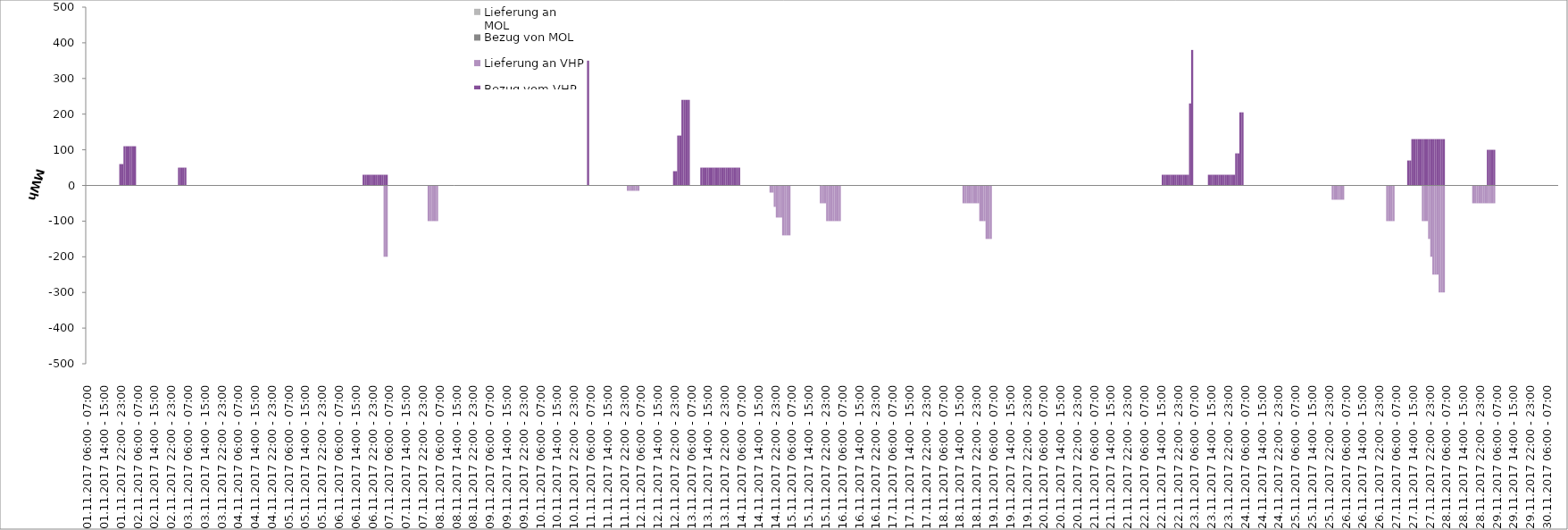
| Category | Bezug vom VHP | Lieferung an VHP | Bezug von MOL | Lieferung an MOL |
|---|---|---|---|---|
| 01.11.2017 06:00 - 07:00 | 0 | 0 | 0 | 0 |
| 01.11.2017 07:00 - 08:00 | 0 | 0 | 0 | 0 |
| 01.11.2017 08:00 - 09:00 | 0 | 0 | 0 | 0 |
| 01.11.2017 09:00 - 10:00 | 0 | 0 | 0 | 0 |
| 01.11.2017 10:00 - 11:00 | 0 | 0 | 0 | 0 |
| 01.11.2017 11:00 - 12:00 | 0 | 0 | 0 | 0 |
| 01.11.2017 12:00 - 13:00 | 0 | 0 | 0 | 0 |
| 01.11.2017 13:00 - 14:00 | 0 | 0 | 0 | 0 |
| 01.11.2017 14:00 - 15:00 | 0 | 0 | 0 | 0 |
| 01.11.2017 15:00 - 16:00 | 0 | 0 | 0 | 0 |
| 01.11.2017 16:00 - 17:00 | 0 | 0 | 0 | 0 |
| 01.11.2017 17:00 - 18:00 | 0 | 0 | 0 | 0 |
| 01.11.2017 18:00 - 19:00 | 0 | 0 | 0 | 0 |
| 01.11.2017 19:00 - 20:00 | 0 | 0 | 0 | 0 |
| 01.11.2017 20:00 - 21:00 | 0 | 0 | 0 | 0 |
| 01.11.2017 21:00 - 22:00 | 0 | 0 | 0 | 0 |
| 01.11.2017 22:00 - 23:00 | 60 | 0 | 0 | 0 |
| 01.11.2017 23:00 - 24:00 | 60 | 0 | 0 | 0 |
| 02.11.2017 00:00 - 01:00 | 110 | 0 | 0 | 0 |
| 02.11.2017 01:00 - 02:00 | 110 | 0 | 0 | 0 |
| 02.11.2017 02:00 - 03:00 | 110 | 0 | 0 | 0 |
| 02.11.2017 03:00 - 04:00 | 110 | 0 | 0 | 0 |
| 02.11.2017 04:00 - 05:00 | 110 | 0 | 0 | 0 |
| 02.11.2017 05:00 - 06:00 | 110 | 0 | 0 | 0 |
| 02.11.2017 06:00 - 07:00 | 0 | 0 | 0 | 0 |
| 02.11.2017 07:00 - 08:00 | 0 | 0 | 0 | 0 |
| 02.11.2017 08:00 - 09:00 | 0 | 0 | 0 | 0 |
| 02.11.2017 09:00 - 10:00 | 0 | 0 | 0 | 0 |
| 02.11.2017 10:00 - 11:00 | 0 | 0 | 0 | 0 |
| 02.11.2017 11:00 - 12:00 | 0 | 0 | 0 | 0 |
| 02.11.2017 12:00 - 13:00 | 0 | 0 | 0 | 0 |
| 02.11.2017 13:00 - 14:00 | 0 | 0 | 0 | 0 |
| 02.11.2017 14:00 - 15:00 | 0 | 0 | 0 | 0 |
| 02.11.2017 15:00 - 16:00 | 0 | 0 | 0 | 0 |
| 02.11.2017 16:00 - 17:00 | 0 | 0 | 0 | 0 |
| 02.11.2017 17:00 - 18:00 | 0 | 0 | 0 | 0 |
| 02.11.2017 18:00 - 19:00 | 0 | 0 | 0 | 0 |
| 02.11.2017 19:00 - 20:00 | 0 | 0 | 0 | 0 |
| 02.11.2017 20:00 - 21:00 | 0 | 0 | 0 | 0 |
| 02.11.2017 21:00 - 22:00 | 0 | 0 | 0 | 0 |
| 02.11.2017 22:00 - 23:00 | 0 | 0 | 0 | 0 |
| 02.11.2017 23:00 - 24:00 | 0 | 0 | 0 | 0 |
| 03.11.2017 00:00 - 01:00 | 0 | 0 | 0 | 0 |
| 03.11.2017 01:00 - 02:00 | 0 | 0 | 0 | 0 |
| 03.11.2017 02:00 - 03:00 | 50 | 0 | 0 | 0 |
| 03.11.2017 03:00 - 04:00 | 50 | 0 | 0 | 0 |
| 03.11.2017 04:00 - 05:00 | 50 | 0 | 0 | 0 |
| 03.11.2017 05:00 - 06:00 | 50 | 0 | 0 | 0 |
| 03.11.2017 06:00 - 07:00 | 0 | 0 | 0 | 0 |
| 03.11.2017 07:00 - 08:00 | 0 | 0 | 0 | 0 |
| 03.11.2017 08:00 - 09:00 | 0 | 0 | 0 | 0 |
| 03.11.2017 09:00 - 10:00 | 0 | 0 | 0 | 0 |
| 03.11.2017 10:00 - 11:00 | 0 | 0 | 0 | 0 |
| 03.11.2017 11:00 - 12:00 | 0 | 0 | 0 | 0 |
| 03.11.2017 12:00 - 13:00 | 0 | 0 | 0 | 0 |
| 03.11.2017 13:00 - 14:00 | 0 | 0 | 0 | 0 |
| 03.11.2017 14:00 - 15:00 | 0 | 0 | 0 | 0 |
| 03.11.2017 15:00 - 16:00 | 0 | 0 | 0 | 0 |
| 03.11.2017 16:00 - 17:00 | 0 | 0 | 0 | 0 |
| 03.11.2017 17:00 - 18:00 | 0 | 0 | 0 | 0 |
| 03.11.2017 18:00 - 19:00 | 0 | 0 | 0 | 0 |
| 03.11.2017 19:00 - 20:00 | 0 | 0 | 0 | 0 |
| 03.11.2017 20:00 - 21:00 | 0 | 0 | 0 | 0 |
| 03.11.2017 21:00 - 22:00 | 0 | 0 | 0 | 0 |
| 03.11.2017 22:00 - 23:00 | 0 | 0 | 0 | 0 |
| 03.11.2017 23:00 - 24:00 | 0 | 0 | 0 | 0 |
| 04.11.2017 00:00 - 01:00 | 0 | 0 | 0 | 0 |
| 04.11.2017 01:00 - 02:00 | 0 | 0 | 0 | 0 |
| 04.11.2017 02:00 - 03:00 | 0 | 0 | 0 | 0 |
| 04.11.2017 03:00 - 04:00 | 0 | 0 | 0 | 0 |
| 04.11.2017 04:00 - 05:00 | 0 | 0 | 0 | 0 |
| 04.11.2017 05:00 - 06:00 | 0 | 0 | 0 | 0 |
| 04.11.2017 06:00 - 07:00 | 0 | 0 | 0 | 0 |
| 04.11.2017 07:00 - 08:00 | 0 | 0 | 0 | 0 |
| 04.11.2017 08:00 - 09:00 | 0 | 0 | 0 | 0 |
| 04.11.2017 09:00 - 10:00 | 0 | 0 | 0 | 0 |
| 04.11.2017 10:00 - 11:00 | 0 | 0 | 0 | 0 |
| 04.11.2017 11:00 - 12:00 | 0 | 0 | 0 | 0 |
| 04.11.2017 12:00 - 13:00 | 0 | 0 | 0 | 0 |
| 04.11.2017 13:00 - 14:00 | 0 | 0 | 0 | 0 |
| 04.11.2017 14:00 - 15:00 | 0 | 0 | 0 | 0 |
| 04.11.2017 15:00 - 16:00 | 0 | 0 | 0 | 0 |
| 04.11.2017 16:00 - 17:00 | 0 | 0 | 0 | 0 |
| 04.11.2017 17:00 - 18:00 | 0 | 0 | 0 | 0 |
| 04.11.2017 18:00 - 19:00 | 0 | 0 | 0 | 0 |
| 04.11.2017 19:00 - 20:00 | 0 | 0 | 0 | 0 |
| 04.11.2017 20:00 - 21:00 | 0 | 0 | 0 | 0 |
| 04.11.2017 21:00 - 22:00 | 0 | 0 | 0 | 0 |
| 04.11.2017 22:00 - 23:00 | 0 | 0 | 0 | 0 |
| 04.11.2017 23:00 - 24:00 | 0 | 0 | 0 | 0 |
| 05.11.2017 00:00 - 01:00 | 0 | 0 | 0 | 0 |
| 05.11.2017 01:00 - 02:00 | 0 | 0 | 0 | 0 |
| 05.11.2017 02:00 - 03:00 | 0 | 0 | 0 | 0 |
| 05.11.2017 03:00 - 04:00 | 0 | 0 | 0 | 0 |
| 05.11.2017 04:00 - 05:00 | 0 | 0 | 0 | 0 |
| 05.11.2017 05:00 - 06:00 | 0 | 0 | 0 | 0 |
| 05.11.2017 06:00 - 07:00 | 0 | 0 | 0 | 0 |
| 05.11.2017 07:00 - 08:00 | 0 | 0 | 0 | 0 |
| 05.11.2017 08:00 - 09:00 | 0 | 0 | 0 | 0 |
| 05.11.2017 09:00 - 10:00 | 0 | 0 | 0 | 0 |
| 05.11.2017 10:00 - 11:00 | 0 | 0 | 0 | 0 |
| 05.11.2017 11:00 - 12:00 | 0 | 0 | 0 | 0 |
| 05.11.2017 12:00 - 13:00 | 0 | 0 | 0 | 0 |
| 05.11.2017 13:00 - 14:00 | 0 | 0 | 0 | 0 |
| 05.11.2017 14:00 - 15:00 | 0 | 0 | 0 | 0 |
| 05.11.2017 15:00 - 16:00 | 0 | 0 | 0 | 0 |
| 05.11.2017 16:00 - 17:00 | 0 | 0 | 0 | 0 |
| 05.11.2017 17:00 - 18:00 | 0 | 0 | 0 | 0 |
| 05.11.2017 18:00 - 19:00 | 0 | 0 | 0 | 0 |
| 05.11.2017 19:00 - 20:00 | 0 | 0 | 0 | 0 |
| 05.11.2017 20:00 - 21:00 | 0 | 0 | 0 | 0 |
| 05.11.2017 21:00 - 22:00 | 0 | 0 | 0 | 0 |
| 05.11.2017 22:00 - 23:00 | 0 | 0 | 0 | 0 |
| 05.11.2017 23:00 - 24:00 | 0 | 0 | 0 | 0 |
| 06.11.2017 00:00 - 01:00 | 0 | 0 | 0 | 0 |
| 06.11.2017 01:00 - 02:00 | 0 | 0 | 0 | 0 |
| 06.11.2017 02:00 - 03:00 | 0 | 0 | 0 | 0 |
| 06.11.2017 03:00 - 04:00 | 0 | 0 | 0 | 0 |
| 06.11.2017 04:00 - 05:00 | 0 | 0 | 0 | 0 |
| 06.11.2017 05:00 - 06:00 | 0 | 0 | 0 | 0 |
| 06.11.2017 06:00 - 07:00 | 0 | 0 | 0 | 0 |
| 06.11.2017 07:00 - 08:00 | 0 | 0 | 0 | 0 |
| 06.11.2017 08:00 - 09:00 | 0 | 0 | 0 | 0 |
| 06.11.2017 09:00 - 10:00 | 0 | 0 | 0 | 0 |
| 06.11.2017 10:00 - 11:00 | 0 | 0 | 0 | 0 |
| 06.11.2017 11:00 - 12:00 | 0 | 0 | 0 | 0 |
| 06.11.2017 12:00 - 13:00 | 0 | 0 | 0 | 0 |
| 06.11.2017 13:00 - 14:00 | 0 | 0 | 0 | 0 |
| 06.11.2017 14:00 - 15:00 | 0 | 0 | 0 | 0 |
| 06.11.2017 15:00 - 16:00 | 0 | 0 | 0 | 0 |
| 06.11.2017 16:00 - 17:00 | 0 | 0 | 0 | 0 |
| 06.11.2017 17:00 - 18:00 | 0 | 0 | 0 | 0 |
| 06.11.2017 18:00 - 19:00 | 30 | 0 | 0 | 0 |
| 06.11.2017 19:00 - 20:00 | 30 | 0 | 0 | 0 |
| 06.11.2017 20:00 - 21:00 | 30 | 0 | 0 | 0 |
| 06.11.2017 21:00 - 22:00 | 30 | 0 | 0 | 0 |
| 06.11.2017 22:00 - 23:00 | 30 | 0 | 0 | 0 |
| 06.11.2017 23:00 - 24:00 | 30 | 0 | 0 | 0 |
| 07.11.2017 00:00 - 01:00 | 30 | 0 | 0 | 0 |
| 07.11.2017 01:00 - 02:00 | 30 | 0 | 0 | 0 |
| 07.11.2017 02:00 - 03:00 | 30 | 0 | 0 | 0 |
| 07.11.2017 03:00 - 04:00 | 30 | 0 | 0 | 0 |
| 07.11.2017 04:00 - 05:00 | 30 | -200 | 0 | 0 |
| 07.11.2017 05:00 - 06:00 | 30 | -200 | 0 | 0 |
| 07.11.2017 06:00 - 07:00 | 0 | 0 | 0 | 0 |
| 07.11.2017 07:00 - 08:00 | 0 | 0 | 0 | 0 |
| 07.11.2017 08:00 - 09:00 | 0 | 0 | 0 | 0 |
| 07.11.2017 09:00 - 10:00 | 0 | 0 | 0 | 0 |
| 07.11.2017 10:00 - 11:00 | 0 | 0 | 0 | 0 |
| 07.11.2017 11:00 - 12:00 | 0 | 0 | 0 | 0 |
| 07.11.2017 12:00 - 13:00 | 0 | 0 | 0 | 0 |
| 07.11.2017 13:00 - 14:00 | 0 | 0 | 0 | 0 |
| 07.11.2017 14:00 - 15:00 | 0 | 0 | 0 | 0 |
| 07.11.2017 15:00 - 16:00 | 0 | 0 | 0 | 0 |
| 07.11.2017 16:00 - 17:00 | 0 | 0 | 0 | 0 |
| 07.11.2017 17:00 - 18:00 | 0 | 0 | 0 | 0 |
| 07.11.2017 18:00 - 19:00 | 0 | 0 | 0 | 0 |
| 07.11.2017 19:00 - 20:00 | 0 | 0 | 0 | 0 |
| 07.11.2017 20:00 - 21:00 | 0 | 0 | 0 | 0 |
| 07.11.2017 21:00 - 22:00 | 0 | 0 | 0 | 0 |
| 07.11.2017 22:00 - 23:00 | 0 | 0 | 0 | 0 |
| 07.11.2017 23:00 - 24:00 | 0 | 0 | 0 | 0 |
| 08.11.2017 00:00 - 01:00 | 0 | 0 | 0 | 0 |
| 08.11.2017 01:00 - 02:00 | 0 | -100 | 0 | 0 |
| 08.11.2017 02:00 - 03:00 | 0 | -100 | 0 | 0 |
| 08.11.2017 03:00 - 04:00 | 0 | -100 | 0 | 0 |
| 08.11.2017 04:00 - 05:00 | 0 | -100 | 0 | 0 |
| 08.11.2017 05:00 - 06:00 | 0 | -100 | 0 | 0 |
| 08.11.2017 06:00 - 07:00 | 0 | 0 | 0 | 0 |
| 08.11.2017 07:00 - 08:00 | 0 | 0 | 0 | 0 |
| 08.11.2017 08:00 - 09:00 | 0 | 0 | 0 | 0 |
| 08.11.2017 09:00 - 10:00 | 0 | 0 | 0 | 0 |
| 08.11.2017 10:00 - 11:00 | 0 | 0 | 0 | 0 |
| 08.11.2017 11:00 - 12:00 | 0 | 0 | 0 | 0 |
| 08.11.2017 12:00 - 13:00 | 0 | 0 | 0 | 0 |
| 08.11.2017 13:00 - 14:00 | 0 | 0 | 0 | 0 |
| 08.11.2017 14:00 - 15:00 | 0 | 0 | 0 | 0 |
| 08.11.2017 15:00 - 16:00 | 0 | 0 | 0 | 0 |
| 08.11.2017 16:00 - 17:00 | 0 | 0 | 0 | 0 |
| 08.11.2017 17:00 - 18:00 | 0 | 0 | 0 | 0 |
| 08.11.2017 18:00 - 19:00 | 0 | 0 | 0 | 0 |
| 08.11.2017 19:00 - 20:00 | 0 | 0 | 0 | 0 |
| 08.11.2017 20:00 - 21:00 | 0 | 0 | 0 | 0 |
| 08.11.2017 21:00 - 22:00 | 0 | 0 | 0 | 0 |
| 08.11.2017 22:00 - 23:00 | 0 | 0 | 0 | 0 |
| 08.11.2017 23:00 - 24:00 | 0 | 0 | 0 | 0 |
| 09.11.2017 00:00 - 01:00 | 0 | 0 | 0 | 0 |
| 09.11.2017 01:00 - 02:00 | 0 | 0 | 0 | 0 |
| 09.11.2017 02:00 - 03:00 | 0 | 0 | 0 | 0 |
| 09.11.2017 03:00 - 04:00 | 0 | 0 | 0 | 0 |
| 09.11.2017 04:00 - 05:00 | 0 | 0 | 0 | 0 |
| 09.11.2017 05:00 - 06:00 | 0 | 0 | 0 | 0 |
| 09.11.2017 06:00 - 07:00 | 0 | 0 | 0 | 0 |
| 09.11.2017 07:00 - 08:00 | 0 | 0 | 0 | 0 |
| 09.11.2017 08:00 - 09:00 | 0 | 0 | 0 | 0 |
| 09.11.2017 09:00 - 10:00 | 0 | 0 | 0 | 0 |
| 09.11.2017 10:00 - 11:00 | 0 | 0 | 0 | 0 |
| 09.11.2017 11:00 - 12:00 | 0 | 0 | 0 | 0 |
| 09.11.2017 12:00 - 13:00 | 0 | 0 | 0 | 0 |
| 09.11.2017 13:00 - 14:00 | 0 | 0 | 0 | 0 |
| 09.11.2017 14:00 - 15:00 | 0 | 0 | 0 | 0 |
| 09.11.2017 15:00 - 16:00 | 0 | 0 | 0 | 0 |
| 09.11.2017 16:00 - 17:00 | 0 | 0 | 0 | 0 |
| 09.11.2017 17:00 - 18:00 | 0 | 0 | 0 | 0 |
| 09.11.2017 18:00 - 19:00 | 0 | 0 | 0 | 0 |
| 09.11.2017 19:00 - 20:00 | 0 | 0 | 0 | 0 |
| 09.11.2017 20:00 - 21:00 | 0 | 0 | 0 | 0 |
| 09.11.2017 21:00 - 22:00 | 0 | 0 | 0 | 0 |
| 09.11.2017 22:00 - 23:00 | 0 | 0 | 0 | 0 |
| 09.11.2017 23:00 - 24:00 | 0 | 0 | 0 | 0 |
| 10.11.2017 00:00 - 01:00 | 0 | 0 | 0 | 0 |
| 10.11.2017 01:00 - 02:00 | 0 | 0 | 0 | 0 |
| 10.11.2017 02:00 - 03:00 | 0 | 0 | 0 | 0 |
| 10.11.2017 03:00 - 04:00 | 0 | 0 | 0 | 0 |
| 10.11.2017 04:00 - 05:00 | 0 | 0 | 0 | 0 |
| 10.11.2017 05:00 - 06:00 | 0 | 0 | 0 | 0 |
| 10.11.2017 06:00 - 07:00 | 0 | 0 | 0 | 0 |
| 10.11.2017 07:00 - 08:00 | 0 | 0 | 0 | 0 |
| 10.11.2017 08:00 - 09:00 | 0 | 0 | 0 | 0 |
| 10.11.2017 09:00 - 10:00 | 0 | 0 | 0 | 0 |
| 10.11.2017 10:00 - 11:00 | 0 | 0 | 0 | 0 |
| 10.11.2017 11:00 - 12:00 | 0 | 0 | 0 | 0 |
| 10.11.2017 12:00 - 13:00 | 0 | 0 | 0 | 0 |
| 10.11.2017 13:00 - 14:00 | 0 | 0 | 0 | 0 |
| 10.11.2017 14:00 - 15:00 | 0 | 0 | 0 | 0 |
| 10.11.2017 15:00 - 16:00 | 0 | 0 | 0 | 0 |
| 10.11.2017 16:00 - 17:00 | 0 | 0 | 0 | 0 |
| 10.11.2017 17:00 - 18:00 | 0 | 0 | 0 | 0 |
| 10.11.2017 18:00 - 19:00 | 0 | 0 | 0 | 0 |
| 10.11.2017 19:00 - 20:00 | 0 | 0 | 0 | 0 |
| 10.11.2017 20:00 - 21:00 | 0 | 0 | 0 | 0 |
| 10.11.2017 21:00 - 22:00 | 0 | 0 | 0 | 0 |
| 10.11.2017 22:00 - 23:00 | 0 | 0 | 0 | 0 |
| 10.11.2017 23:00 - 24:00 | 0 | 0 | 0 | 0 |
| 11.11.2017 00:00 - 01:00 | 0 | 0 | 0 | 0 |
| 11.11.2017 01:00 - 02:00 | 0 | 0 | 0 | 0 |
| 11.11.2017 02:00 - 03:00 | 0 | 0 | 0 | 0 |
| 11.11.2017 03:00 - 04:00 | 0 | 0 | 0 | 0 |
| 11.11.2017 04:00 - 05:00 | 0 | 0 | 0 | 0 |
| 11.11.2017 05:00 - 06:00 | 350 | 0 | 0 | 0 |
| 11.11.2017 06:00 - 07:00 | 0 | 0 | 0 | 0 |
| 11.11.2017 07:00 - 08:00 | 0 | 0 | 0 | 0 |
| 11.11.2017 08:00 - 09:00 | 0 | 0 | 0 | 0 |
| 11.11.2017 09:00 - 10:00 | 0 | 0 | 0 | 0 |
| 11.11.2017 10:00 - 11:00 | 0 | 0 | 0 | 0 |
| 11.11.2017 11:00 - 12:00 | 0 | 0 | 0 | 0 |
| 11.11.2017 12:00 - 13:00 | 0 | 0 | 0 | 0 |
| 11.11.2017 13:00 - 14:00 | 0 | 0 | 0 | 0 |
| 11.11.2017 14:00 - 15:00 | 0 | 0 | 0 | 0 |
| 11.11.2017 15:00 - 16:00 | 0 | 0 | 0 | 0 |
| 11.11.2017 16:00 - 17:00 | 0 | 0 | 0 | 0 |
| 11.11.2017 17:00 - 18:00 | 0 | 0 | 0 | 0 |
| 11.11.2017 18:00 - 19:00 | 0 | 0 | 0 | 0 |
| 11.11.2017 19:00 - 20:00 | 0 | 0 | 0 | 0 |
| 11.11.2017 20:00 - 21:00 | 0 | 0 | 0 | 0 |
| 11.11.2017 21:00 - 22:00 | 0 | 0 | 0 | 0 |
| 11.11.2017 22:00 - 23:00 | 0 | 0 | 0 | 0 |
| 11.11.2017 23:00 - 24:00 | 0 | 0 | 0 | 0 |
| 12.11.2017 00:00 - 01:00 | 0 | -15 | 0 | 0 |
| 12.11.2017 01:00 - 02:00 | 0 | -15 | 0 | 0 |
| 12.11.2017 02:00 - 03:00 | 0 | -15 | 0 | 0 |
| 12.11.2017 03:00 - 04:00 | 0 | -15 | 0 | 0 |
| 12.11.2017 04:00 - 05:00 | 0 | -15 | 0 | 0 |
| 12.11.2017 05:00 - 06:00 | 0 | -15 | 0 | 0 |
| 12.11.2017 06:00 - 07:00 | 0 | 0 | 0 | 0 |
| 12.11.2017 07:00 - 08:00 | 0 | 0 | 0 | 0 |
| 12.11.2017 08:00 - 09:00 | 0 | 0 | 0 | 0 |
| 12.11.2017 09:00 - 10:00 | 0 | 0 | 0 | 0 |
| 12.11.2017 10:00 - 11:00 | 0 | 0 | 0 | 0 |
| 12.11.2017 11:00 - 12:00 | 0 | 0 | 0 | 0 |
| 12.11.2017 12:00 - 13:00 | 0 | 0 | 0 | 0 |
| 12.11.2017 13:00 - 14:00 | 0 | 0 | 0 | 0 |
| 12.11.2017 14:00 - 15:00 | 0 | 0 | 0 | 0 |
| 12.11.2017 15:00 - 16:00 | 0 | 0 | 0 | 0 |
| 12.11.2017 16:00 - 17:00 | 0 | 0 | 0 | 0 |
| 12.11.2017 17:00 - 18:00 | 0 | 0 | 0 | 0 |
| 12.11.2017 18:00 - 19:00 | 0 | 0 | 0 | 0 |
| 12.11.2017 19:00 - 20:00 | 0 | 0 | 0 | 0 |
| 12.11.2017 20:00 - 21:00 | 0 | 0 | 0 | 0 |
| 12.11.2017 21:00 - 22:00 | 0 | 0 | 0 | 0 |
| 12.11.2017 22:00 - 23:00 | 40 | 0 | 0 | 0 |
| 12.11.2017 23:00 - 24:00 | 40 | 0 | 0 | 0 |
| 13.11.2017 00:00 - 01:00 | 140 | 0 | 0 | 0 |
| 13.11.2017 01:00 - 02:00 | 140 | 0 | 0 | 0 |
| 13.11.2017 02:00 - 03:00 | 240 | 0 | 0 | 0 |
| 13.11.2017 03:00 - 04:00 | 240 | 0 | 0 | 0 |
| 13.11.2017 04:00 - 05:00 | 240 | 0 | 0 | 0 |
| 13.11.2017 05:00 - 06:00 | 240 | 0 | 0 | 0 |
| 13.11.2017 06:00 - 07:00 | 0 | 0 | 0 | 0 |
| 13.11.2017 07:00 - 08:00 | 0 | 0 | 0 | 0 |
| 13.11.2017 08:00 - 09:00 | 0 | 0 | 0 | 0 |
| 13.11.2017 09:00 - 10:00 | 0 | 0 | 0 | 0 |
| 13.11.2017 10:00 - 11:00 | 0 | 0 | 0 | 0 |
| 13.11.2017 11:00 - 12:00 | 50 | 0 | 0 | 0 |
| 13.11.2017 12:00 - 13:00 | 50 | 0 | 0 | 0 |
| 13.11.2017 13:00 - 14:00 | 50 | 0 | 0 | 0 |
| 13.11.2017 14:00 - 15:00 | 50 | 0 | 0 | 0 |
| 13.11.2017 15:00 - 16:00 | 50 | 0 | 0 | 0 |
| 13.11.2017 16:00 - 17:00 | 50 | 0 | 0 | 0 |
| 13.11.2017 17:00 - 18:00 | 50 | 0 | 0 | 0 |
| 13.11.2017 18:00 - 19:00 | 50 | 0 | 0 | 0 |
| 13.11.2017 19:00 - 20:00 | 50 | 0 | 0 | 0 |
| 13.11.2017 20:00 - 21:00 | 50 | 0 | 0 | 0 |
| 13.11.2017 21:00 - 22:00 | 50 | 0 | 0 | 0 |
| 13.11.2017 22:00 - 23:00 | 50 | 0 | 0 | 0 |
| 13.11.2017 23:00 - 24:00 | 50 | 0 | 0 | 0 |
| 14.11.2017 00:00 - 01:00 | 50 | 0 | 0 | 0 |
| 14.11.2017 01:00 - 02:00 | 50 | 0 | 0 | 0 |
| 14.11.2017 02:00 - 03:00 | 50 | 0 | 0 | 0 |
| 14.11.2017 03:00 - 04:00 | 50 | 0 | 0 | 0 |
| 14.11.2017 04:00 - 05:00 | 50 | 0 | 0 | 0 |
| 14.11.2017 05:00 - 06:00 | 50 | 0 | 0 | 0 |
| 14.11.2017 06:00 - 07:00 | 0 | 0 | 0 | 0 |
| 14.11.2017 07:00 - 08:00 | 0 | 0 | 0 | 0 |
| 14.11.2017 08:00 - 09:00 | 0 | 0 | 0 | 0 |
| 14.11.2017 09:00 - 10:00 | 0 | 0 | 0 | 0 |
| 14.11.2017 10:00 - 11:00 | 0 | 0 | 0 | 0 |
| 14.11.2017 11:00 - 12:00 | 0 | 0 | 0 | 0 |
| 14.11.2017 12:00 - 13:00 | 0 | 0 | 0 | 0 |
| 14.11.2017 13:00 - 14:00 | 0 | 0 | 0 | 0 |
| 14.11.2017 14:00 - 15:00 | 0 | 0 | 0 | 0 |
| 14.11.2017 15:00 - 16:00 | 0 | 0 | 0 | 0 |
| 14.11.2017 16:00 - 17:00 | 0 | 0 | 0 | 0 |
| 14.11.2017 17:00 - 18:00 | 0 | 0 | 0 | 0 |
| 14.11.2017 18:00 - 19:00 | 0 | 0 | 0 | 0 |
| 14.11.2017 19:00 - 20:00 | 0 | 0 | 0 | 0 |
| 14.11.2017 20:00 - 21:00 | 0 | -20 | 0 | 0 |
| 14.11.2017 21:00 - 22:00 | 0 | -20 | 0 | 0 |
| 14.11.2017 22:00 - 23:00 | 0 | -60 | 0 | 0 |
| 14.11.2017 23:00 - 24:00 | 0 | -90 | 0 | 0 |
| 15.11.2017 00:00 - 01:00 | 0 | -90 | 0 | 0 |
| 15.11.2017 01:00 - 02:00 | 0 | -90 | 0 | 0 |
| 15.11.2017 02:00 - 03:00 | 0 | -140 | 0 | 0 |
| 15.11.2017 03:00 - 04:00 | 0 | -140 | 0 | 0 |
| 15.11.2017 04:00 - 05:00 | 0 | -140 | 0 | 0 |
| 15.11.2017 05:00 - 06:00 | 0 | -140 | 0 | 0 |
| 15.11.2017 06:00 - 07:00 | 0 | 0 | 0 | 0 |
| 15.11.2017 07:00 - 08:00 | 0 | 0 | 0 | 0 |
| 15.11.2017 08:00 - 09:00 | 0 | 0 | 0 | 0 |
| 15.11.2017 09:00 - 10:00 | 0 | 0 | 0 | 0 |
| 15.11.2017 10:00 - 11:00 | 0 | 0 | 0 | 0 |
| 15.11.2017 11:00 - 12:00 | 0 | 0 | 0 | 0 |
| 15.11.2017 12:00 - 13:00 | 0 | 0 | 0 | 0 |
| 15.11.2017 13:00 - 14:00 | 0 | 0 | 0 | 0 |
| 15.11.2017 14:00 - 15:00 | 0 | 0 | 0 | 0 |
| 15.11.2017 15:00 - 16:00 | 0 | 0 | 0 | 0 |
| 15.11.2017 16:00 - 17:00 | 0 | 0 | 0 | 0 |
| 15.11.2017 17:00 - 18:00 | 0 | 0 | 0 | 0 |
| 15.11.2017 18:00 - 19:00 | 0 | 0 | 0 | 0 |
| 15.11.2017 19:00 - 20:00 | 0 | 0 | 0 | 0 |
| 15.11.2017 20:00 - 21:00 | 0 | -50 | 0 | 0 |
| 15.11.2017 21:00 - 22:00 | 0 | -50 | 0 | 0 |
| 15.11.2017 22:00 - 23:00 | 0 | -50 | 0 | 0 |
| 15.11.2017 23:00 - 24:00 | 0 | -100 | 0 | 0 |
| 16.11.2017 00:00 - 01:00 | 0 | -100 | 0 | 0 |
| 16.11.2017 01:00 - 02:00 | 0 | -100 | 0 | 0 |
| 16.11.2017 02:00 - 03:00 | 0 | -100 | 0 | 0 |
| 16.11.2017 03:00 - 04:00 | 0 | -100 | 0 | 0 |
| 16.11.2017 04:00 - 05:00 | 0 | -100 | 0 | 0 |
| 16.11.2017 05:00 - 06:00 | 0 | -100 | 0 | 0 |
| 16.11.2017 06:00 - 07:00 | 0 | 0 | 0 | 0 |
| 16.11.2017 07:00 - 08:00 | 0 | 0 | 0 | 0 |
| 16.11.2017 08:00 - 09:00 | 0 | 0 | 0 | 0 |
| 16.11.2017 09:00 - 10:00 | 0 | 0 | 0 | 0 |
| 16.11.2017 10:00 - 11:00 | 0 | 0 | 0 | 0 |
| 16.11.2017 11:00 - 12:00 | 0 | 0 | 0 | 0 |
| 16.11.2017 12:00 - 13:00 | 0 | 0 | 0 | 0 |
| 16.11.2017 13:00 - 14:00 | 0 | 0 | 0 | 0 |
| 16.11.2017 14:00 - 15:00 | 0 | 0 | 0 | 0 |
| 16.11.2017 15:00 - 16:00 | 0 | 0 | 0 | 0 |
| 16.11.2017 16:00 - 17:00 | 0 | 0 | 0 | 0 |
| 16.11.2017 17:00 - 18:00 | 0 | 0 | 0 | 0 |
| 16.11.2017 18:00 - 19:00 | 0 | 0 | 0 | 0 |
| 16.11.2017 19:00 - 20:00 | 0 | 0 | 0 | 0 |
| 16.11.2017 20:00 - 21:00 | 0 | 0 | 0 | 0 |
| 16.11.2017 21:00 - 22:00 | 0 | 0 | 0 | 0 |
| 16.11.2017 22:00 - 23:00 | 0 | 0 | 0 | 0 |
| 16.11.2017 23:00 - 24:00 | 0 | 0 | 0 | 0 |
| 17.11.2017 00:00 - 01:00 | 0 | 0 | 0 | 0 |
| 17.11.2017 01:00 - 02:00 | 0 | 0 | 0 | 0 |
| 17.11.2017 02:00 - 03:00 | 0 | 0 | 0 | 0 |
| 17.11.2017 03:00 - 04:00 | 0 | 0 | 0 | 0 |
| 17.11.2017 04:00 - 05:00 | 0 | 0 | 0 | 0 |
| 17.11.2017 05:00 - 06:00 | 0 | 0 | 0 | 0 |
| 17.11.2017 06:00 - 07:00 | 0 | 0 | 0 | 0 |
| 17.11.2017 07:00 - 08:00 | 0 | 0 | 0 | 0 |
| 17.11.2017 08:00 - 09:00 | 0 | 0 | 0 | 0 |
| 17.11.2017 09:00 - 10:00 | 0 | 0 | 0 | 0 |
| 17.11.2017 10:00 - 11:00 | 0 | 0 | 0 | 0 |
| 17.11.2017 11:00 - 12:00 | 0 | 0 | 0 | 0 |
| 17.11.2017 12:00 - 13:00 | 0 | 0 | 0 | 0 |
| 17.11.2017 13:00 - 14:00 | 0 | 0 | 0 | 0 |
| 17.11.2017 14:00 - 15:00 | 0 | 0 | 0 | 0 |
| 17.11.2017 15:00 - 16:00 | 0 | 0 | 0 | 0 |
| 17.11.2017 16:00 - 17:00 | 0 | 0 | 0 | 0 |
| 17.11.2017 17:00 - 18:00 | 0 | 0 | 0 | 0 |
| 17.11.2017 18:00 - 19:00 | 0 | 0 | 0 | 0 |
| 17.11.2017 19:00 - 20:00 | 0 | 0 | 0 | 0 |
| 17.11.2017 20:00 - 21:00 | 0 | 0 | 0 | 0 |
| 17.11.2017 21:00 - 22:00 | 0 | 0 | 0 | 0 |
| 17.11.2017 22:00 - 23:00 | 0 | 0 | 0 | 0 |
| 17.11.2017 23:00 - 24:00 | 0 | 0 | 0 | 0 |
| 18.11.2017 00:00 - 01:00 | 0 | 0 | 0 | 0 |
| 18.11.2017 01:00 - 02:00 | 0 | 0 | 0 | 0 |
| 18.11.2017 02:00 - 03:00 | 0 | 0 | 0 | 0 |
| 18.11.2017 03:00 - 04:00 | 0 | 0 | 0 | 0 |
| 18.11.2017 04:00 - 05:00 | 0 | 0 | 0 | 0 |
| 18.11.2017 05:00 - 06:00 | 0 | 0 | 0 | 0 |
| 18.11.2017 06:00 - 07:00 | 0 | 0 | 0 | 0 |
| 18.11.2017 07:00 - 08:00 | 0 | 0 | 0 | 0 |
| 18.11.2017 08:00 - 09:00 | 0 | 0 | 0 | 0 |
| 18.11.2017 09:00 - 10:00 | 0 | 0 | 0 | 0 |
| 18.11.2017 10:00 - 11:00 | 0 | 0 | 0 | 0 |
| 18.11.2017 11:00 - 12:00 | 0 | 0 | 0 | 0 |
| 18.11.2017 12:00 - 13:00 | 0 | 0 | 0 | 0 |
| 18.11.2017 13:00 - 14:00 | 0 | 0 | 0 | 0 |
| 18.11.2017 14:00 - 15:00 | 0 | 0 | 0 | 0 |
| 18.11.2017 15:00 - 16:00 | 0 | 0 | 0 | 0 |
| 18.11.2017 16:00 - 17:00 | 0 | -50 | 0 | 0 |
| 18.11.2017 17:00 - 18:00 | 0 | -50 | 0 | 0 |
| 18.11.2017 18:00 - 19:00 | 0 | -50 | 0 | 0 |
| 18.11.2017 19:00 - 20:00 | 0 | -50 | 0 | 0 |
| 18.11.2017 20:00 - 21:00 | 0 | -50 | 0 | 0 |
| 18.11.2017 21:00 - 22:00 | 0 | -50 | 0 | 0 |
| 18.11.2017 22:00 - 23:00 | 0 | -50 | 0 | 0 |
| 18.11.2017 23:00 - 24:00 | 0 | -50 | 0 | 0 |
| 19.11.2017 00:00 - 01:00 | 0 | -100 | 0 | 0 |
| 19.11.2017 01:00 - 02:00 | 0 | -100 | 0 | 0 |
| 19.11.2017 02:00 - 03:00 | 0 | -100 | 0 | 0 |
| 19.11.2017 03:00 - 04:00 | 0 | -150 | 0 | 0 |
| 19.11.2017 04:00 - 05:00 | 0 | -150 | 0 | 0 |
| 19.11.2017 05:00 - 06:00 | 0 | -150 | 0 | 0 |
| 19.11.2017 06:00 - 07:00 | 0 | 0 | 0 | 0 |
| 19.11.2017 07:00 - 08:00 | 0 | 0 | 0 | 0 |
| 19.11.2017 08:00 - 09:00 | 0 | 0 | 0 | 0 |
| 19.11.2017 09:00 - 10:00 | 0 | 0 | 0 | 0 |
| 19.11.2017 10:00 - 11:00 | 0 | 0 | 0 | 0 |
| 19.11.2017 11:00 - 12:00 | 0 | 0 | 0 | 0 |
| 19.11.2017 12:00 - 13:00 | 0 | 0 | 0 | 0 |
| 19.11.2017 13:00 - 14:00 | 0 | 0 | 0 | 0 |
| 19.11.2017 14:00 - 15:00 | 0 | 0 | 0 | 0 |
| 19.11.2017 15:00 - 16:00 | 0 | 0 | 0 | 0 |
| 19.11.2017 16:00 - 17:00 | 0 | 0 | 0 | 0 |
| 19.11.2017 17:00 - 18:00 | 0 | 0 | 0 | 0 |
| 19.11.2017 18:00 - 19:00 | 0 | 0 | 0 | 0 |
| 19.11.2017 19:00 - 20:00 | 0 | 0 | 0 | 0 |
| 19.11.2017 20:00 - 21:00 | 0 | 0 | 0 | 0 |
| 19.11.2017 21:00 - 22:00 | 0 | 0 | 0 | 0 |
| 19.11.2017 22:00 - 23:00 | 0 | 0 | 0 | 0 |
| 19.11.2017 23:00 - 24:00 | 0 | 0 | 0 | 0 |
| 20.11.2017 00:00 - 01:00 | 0 | 0 | 0 | 0 |
| 20.11.2017 01:00 - 02:00 | 0 | 0 | 0 | 0 |
| 20.11.2017 02:00 - 03:00 | 0 | 0 | 0 | 0 |
| 20.11.2017 03:00 - 04:00 | 0 | 0 | 0 | 0 |
| 20.11.2017 04:00 - 05:00 | 0 | 0 | 0 | 0 |
| 20.11.2017 05:00 - 06:00 | 0 | 0 | 0 | 0 |
| 20.11.2017 06:00 - 07:00 | 0 | 0 | 0 | 0 |
| 20.11.2017 07:00 - 08:00 | 0 | 0 | 0 | 0 |
| 20.11.2017 08:00 - 09:00 | 0 | 0 | 0 | 0 |
| 20.11.2017 09:00 - 10:00 | 0 | 0 | 0 | 0 |
| 20.11.2017 10:00 - 11:00 | 0 | 0 | 0 | 0 |
| 20.11.2017 11:00 - 12:00 | 0 | 0 | 0 | 0 |
| 20.11.2017 12:00 - 13:00 | 0 | 0 | 0 | 0 |
| 20.11.2017 13:00 - 14:00 | 0 | 0 | 0 | 0 |
| 20.11.2017 14:00 - 15:00 | 0 | 0 | 0 | 0 |
| 20.11.2017 15:00 - 16:00 | 0 | 0 | 0 | 0 |
| 20.11.2017 16:00 - 17:00 | 0 | 0 | 0 | 0 |
| 20.11.2017 17:00 - 18:00 | 0 | 0 | 0 | 0 |
| 20.11.2017 18:00 - 19:00 | 0 | 0 | 0 | 0 |
| 20.11.2017 19:00 - 20:00 | 0 | 0 | 0 | 0 |
| 20.11.2017 20:00 - 21:00 | 0 | 0 | 0 | 0 |
| 20.11.2017 21:00 - 22:00 | 0 | 0 | 0 | 0 |
| 20.11.2017 22:00 - 23:00 | 0 | 0 | 0 | 0 |
| 20.11.2017 23:00 - 24:00 | 0 | 0 | 0 | 0 |
| 21.11.2017 00:00 - 01:00 | 0 | 0 | 0 | 0 |
| 21.11.2017 01:00 - 02:00 | 0 | 0 | 0 | 0 |
| 21.11.2017 02:00 - 03:00 | 0 | 0 | 0 | 0 |
| 21.11.2017 03:00 - 04:00 | 0 | 0 | 0 | 0 |
| 21.11.2017 04:00 - 05:00 | 0 | 0 | 0 | 0 |
| 21.11.2017 05:00 - 06:00 | 0 | 0 | 0 | 0 |
| 21.11.2017 06:00 - 07:00 | 0 | 0 | 0 | 0 |
| 21.11.2017 07:00 - 08:00 | 0 | 0 | 0 | 0 |
| 21.11.2017 08:00 - 09:00 | 0 | 0 | 0 | 0 |
| 21.11.2017 09:00 - 10:00 | 0 | 0 | 0 | 0 |
| 21.11.2017 10:00 - 11:00 | 0 | 0 | 0 | 0 |
| 21.11.2017 11:00 - 12:00 | 0 | 0 | 0 | 0 |
| 21.11.2017 12:00 - 13:00 | 0 | 0 | 0 | 0 |
| 21.11.2017 13:00 - 14:00 | 0 | 0 | 0 | 0 |
| 21.11.2017 14:00 - 15:00 | 0 | 0 | 0 | 0 |
| 21.11.2017 15:00 - 16:00 | 0 | 0 | 0 | 0 |
| 21.11.2017 16:00 - 17:00 | 0 | 0 | 0 | 0 |
| 21.11.2017 17:00 - 18:00 | 0 | 0 | 0 | 0 |
| 21.11.2017 18:00 - 19:00 | 0 | 0 | 0 | 0 |
| 21.11.2017 19:00 - 20:00 | 0 | 0 | 0 | 0 |
| 21.11.2017 20:00 - 21:00 | 0 | 0 | 0 | 0 |
| 21.11.2017 21:00 - 22:00 | 0 | 0 | 0 | 0 |
| 21.11.2017 22:00 - 23:00 | 0 | 0 | 0 | 0 |
| 21.11.2017 23:00 - 24:00 | 0 | 0 | 0 | 0 |
| 22.11.2017 00:00 - 01:00 | 0 | 0 | 0 | 0 |
| 22.11.2017 01:00 - 02:00 | 0 | 0 | 0 | 0 |
| 22.11.2017 02:00 - 03:00 | 0 | 0 | 0 | 0 |
| 22.11.2017 03:00 - 04:00 | 0 | 0 | 0 | 0 |
| 22.11.2017 04:00 - 05:00 | 0 | 0 | 0 | 0 |
| 22.11.2017 05:00 - 06:00 | 0 | 0 | 0 | 0 |
| 22.11.2017 06:00 - 07:00 | 0 | 0 | 0 | 0 |
| 22.11.2017 07:00 - 08:00 | 0 | 0 | 0 | 0 |
| 22.11.2017 08:00 - 09:00 | 0 | 0 | 0 | 0 |
| 22.11.2017 09:00 - 10:00 | 0 | 0 | 0 | 0 |
| 22.11.2017 10:00 - 11:00 | 0 | 0 | 0 | 0 |
| 22.11.2017 11:00 - 12:00 | 0 | 0 | 0 | 0 |
| 22.11.2017 12:00 - 13:00 | 0 | 0 | 0 | 0 |
| 22.11.2017 13:00 - 14:00 | 0 | 0 | 0 | 0 |
| 22.11.2017 14:00 - 15:00 | 0 | 0 | 0 | 0 |
| 22.11.2017 15:00 - 16:00 | 30 | 0 | 0 | 0 |
| 22.11.2017 16:00 - 17:00 | 30 | 0 | 0 | 0 |
| 22.11.2017 17:00 - 18:00 | 30 | 0 | 0 | 0 |
| 22.11.2017 18:00 - 19:00 | 30 | 0 | 0 | 0 |
| 22.11.2017 19:00 - 20:00 | 30 | 0 | 0 | 0 |
| 22.11.2017 20:00 - 21:00 | 30 | 0 | 0 | 0 |
| 22.11.2017 21:00 - 22:00 | 30 | 0 | 0 | 0 |
| 22.11.2017 22:00 - 23:00 | 30 | 0 | 0 | 0 |
| 22.11.2017 23:00 - 24:00 | 30 | 0 | 0 | 0 |
| 23.11.2017 00:00 - 01:00 | 30 | 0 | 0 | 0 |
| 23.11.2017 01:00 - 02:00 | 30 | 0 | 0 | 0 |
| 23.11.2017 02:00 - 03:00 | 30 | 0 | 0 | 0 |
| 23.11.2017 03:00 - 04:00 | 30 | 0 | 0 | 0 |
| 23.11.2017 04:00 - 05:00 | 230 | 0 | 0 | 0 |
| 23.11.2017 05:00 - 06:00 | 380 | 0 | 0 | 0 |
| 23.11.2017 06:00 - 07:00 | 0 | 0 | 0 | 0 |
| 23.11.2017 07:00 - 08:00 | 0 | 0 | 0 | 0 |
| 23.11.2017 08:00 - 09:00 | 0 | 0 | 0 | 0 |
| 23.11.2017 09:00 - 10:00 | 0 | 0 | 0 | 0 |
| 23.11.2017 10:00 - 11:00 | 0 | 0 | 0 | 0 |
| 23.11.2017 11:00 - 12:00 | 0 | 0 | 0 | 0 |
| 23.11.2017 12:00 - 13:00 | 0 | 0 | 0 | 0 |
| 23.11.2017 13:00 - 14:00 | 30 | 0 | 0 | 0 |
| 23.11.2017 14:00 - 15:00 | 30 | 0 | 0 | 0 |
| 23.11.2017 15:00 - 16:00 | 30 | 0 | 0 | 0 |
| 23.11.2017 16:00 - 17:00 | 30 | 0 | 0 | 0 |
| 23.11.2017 17:00 - 18:00 | 30 | 0 | 0 | 0 |
| 23.11.2017 18:00 - 19:00 | 30 | 0 | 0 | 0 |
| 23.11.2017 19:00 - 20:00 | 30 | 0 | 0 | 0 |
| 23.11.2017 20:00 - 21:00 | 30 | 0 | 0 | 0 |
| 23.11.2017 21:00 - 22:00 | 30 | 0 | 0 | 0 |
| 23.11.2017 22:00 - 23:00 | 30 | 0 | 0 | 0 |
| 23.11.2017 23:00 - 24:00 | 30 | 0 | 0 | 0 |
| 24.11.2017 00:00 - 01:00 | 30 | 0 | 0 | 0 |
| 24.11.2017 01:00 - 02:00 | 30 | 0 | 0 | 0 |
| 24.11.2017 02:00 - 03:00 | 90 | 0 | 0 | 0 |
| 24.11.2017 03:00 - 04:00 | 90 | 0 | 0 | 0 |
| 24.11.2017 04:00 - 05:00 | 205 | 0 | 0 | 0 |
| 24.11.2017 05:00 - 06:00 | 205 | 0 | 0 | 0 |
| 24.11.2017 06:00 - 07:00 | 0 | 0 | 0 | 0 |
| 24.11.2017 07:00 - 08:00 | 0 | 0 | 0 | 0 |
| 24.11.2017 08:00 - 09:00 | 0 | 0 | 0 | 0 |
| 24.11.2017 09:00 - 10:00 | 0 | 0 | 0 | 0 |
| 24.11.2017 10:00 - 11:00 | 0 | 0 | 0 | 0 |
| 24.11.2017 11:00 - 12:00 | 0 | 0 | 0 | 0 |
| 24.11.2017 12:00 - 13:00 | 0 | 0 | 0 | 0 |
| 24.11.2017 13:00 - 14:00 | 0 | 0 | 0 | 0 |
| 24.11.2017 14:00 - 15:00 | 0 | 0 | 0 | 0 |
| 24.11.2017 15:00 - 16:00 | 0 | 0 | 0 | 0 |
| 24.11.2017 16:00 - 17:00 | 0 | 0 | 0 | 0 |
| 24.11.2017 17:00 - 18:00 | 0 | 0 | 0 | 0 |
| 24.11.2017 18:00 - 19:00 | 0 | 0 | 0 | 0 |
| 24.11.2017 19:00 - 20:00 | 0 | 0 | 0 | 0 |
| 24.11.2017 20:00 - 21:00 | 0 | 0 | 0 | 0 |
| 24.11.2017 21:00 - 22:00 | 0 | 0 | 0 | 0 |
| 24.11.2017 22:00 - 23:00 | 0 | 0 | 0 | 0 |
| 24.11.2017 23:00 - 24:00 | 0 | 0 | 0 | 0 |
| 25.11.2017 00:00 - 01:00 | 0 | 0 | 0 | 0 |
| 25.11.2017 01:00 - 02:00 | 0 | 0 | 0 | 0 |
| 25.11.2017 02:00 - 03:00 | 0 | 0 | 0 | 0 |
| 25.11.2017 03:00 - 04:00 | 0 | 0 | 0 | 0 |
| 25.11.2017 04:00 - 05:00 | 0 | 0 | 0 | 0 |
| 25.11.2017 05:00 - 06:00 | 0 | 0 | 0 | 0 |
| 25.11.2017 06:00 - 07:00 | 0 | 0 | 0 | 0 |
| 25.11.2017 07:00 - 08:00 | 0 | 0 | 0 | 0 |
| 25.11.2017 08:00 - 09:00 | 0 | 0 | 0 | 0 |
| 25.11.2017 09:00 - 10:00 | 0 | 0 | 0 | 0 |
| 25.11.2017 10:00 - 11:00 | 0 | 0 | 0 | 0 |
| 25.11.2017 11:00 - 12:00 | 0 | 0 | 0 | 0 |
| 25.11.2017 12:00 - 13:00 | 0 | 0 | 0 | 0 |
| 25.11.2017 13:00 - 14:00 | 0 | 0 | 0 | 0 |
| 25.11.2017 14:00 - 15:00 | 0 | 0 | 0 | 0 |
| 25.11.2017 15:00 - 16:00 | 0 | 0 | 0 | 0 |
| 25.11.2017 16:00 - 17:00 | 0 | 0 | 0 | 0 |
| 25.11.2017 17:00 - 18:00 | 0 | 0 | 0 | 0 |
| 25.11.2017 18:00 - 19:00 | 0 | 0 | 0 | 0 |
| 25.11.2017 19:00 - 20:00 | 0 | 0 | 0 | 0 |
| 25.11.2017 20:00 - 21:00 | 0 | 0 | 0 | 0 |
| 25.11.2017 21:00 - 22:00 | 0 | 0 | 0 | 0 |
| 25.11.2017 22:00 - 23:00 | 0 | 0 | 0 | 0 |
| 25.11.2017 23:00 - 24:00 | 0 | 0 | 0 | 0 |
| 26.11.2017 00:00 - 01:00 | 0 | -40 | 0 | 0 |
| 26.11.2017 01:00 - 02:00 | 0 | -40 | 0 | 0 |
| 26.11.2017 02:00 - 03:00 | 0 | -40 | 0 | 0 |
| 26.11.2017 03:00 - 04:00 | 0 | -40 | 0 | 0 |
| 26.11.2017 04:00 - 05:00 | 0 | -40 | 0 | 0 |
| 26.11.2017 05:00 - 06:00 | 0 | -40 | 0 | 0 |
| 26.11.2017 06:00 - 07:00 | 0 | 0 | 0 | 0 |
| 26.11.2017 07:00 - 08:00 | 0 | 0 | 0 | 0 |
| 26.11.2017 08:00 - 09:00 | 0 | 0 | 0 | 0 |
| 26.11.2017 09:00 - 10:00 | 0 | 0 | 0 | 0 |
| 26.11.2017 10:00 - 11:00 | 0 | 0 | 0 | 0 |
| 26.11.2017 11:00 - 12:00 | 0 | 0 | 0 | 0 |
| 26.11.2017 12:00 - 13:00 | 0 | 0 | 0 | 0 |
| 26.11.2017 13:00 - 14:00 | 0 | 0 | 0 | 0 |
| 26.11.2017 14:00 - 15:00 | 0 | 0 | 0 | 0 |
| 26.11.2017 15:00 - 16:00 | 0 | 0 | 0 | 0 |
| 26.11.2017 16:00 - 17:00 | 0 | 0 | 0 | 0 |
| 26.11.2017 17:00 - 18:00 | 0 | 0 | 0 | 0 |
| 26.11.2017 18:00 - 19:00 | 0 | 0 | 0 | 0 |
| 26.11.2017 19:00 - 20:00 | 0 | 0 | 0 | 0 |
| 26.11.2017 20:00 - 21:00 | 0 | 0 | 0 | 0 |
| 26.11.2017 21:00 - 22:00 | 0 | 0 | 0 | 0 |
| 26.11.2017 22:00 - 23:00 | 0 | 0 | 0 | 0 |
| 26.11.2017 23:00 - 24:00 | 0 | 0 | 0 | 0 |
| 27.11.2017 00:00 - 01:00 | 0 | 0 | 0 | 0 |
| 27.11.2017 01:00 - 02:00 | 0 | 0 | 0 | 0 |
| 27.11.2017 02:00 - 03:00 | 0 | -100 | 0 | 0 |
| 27.11.2017 03:00 - 04:00 | 0 | -100 | 0 | 0 |
| 27.11.2017 04:00 - 05:00 | 0 | -100 | 0 | 0 |
| 27.11.2017 05:00 - 06:00 | 0 | -100 | 0 | 0 |
| 27.11.2017 06:00 - 07:00 | 0 | 0 | 0 | 0 |
| 27.11.2017 07:00 - 08:00 | 0 | 0 | 0 | 0 |
| 27.11.2017 08:00 - 09:00 | 0 | 0 | 0 | 0 |
| 27.11.2017 09:00 - 10:00 | 0 | 0 | 0 | 0 |
| 27.11.2017 10:00 - 11:00 | 0 | 0 | 0 | 0 |
| 27.11.2017 11:00 - 12:00 | 0 | 0 | 0 | 0 |
| 27.11.2017 12:00 - 13:00 | 70 | 0 | 0 | 0 |
| 27.11.2017 13:00 - 14:00 | 70 | 0 | 0 | 0 |
| 27.11.2017 14:00 - 15:00 | 130 | 0 | 0 | 0 |
| 27.11.2017 15:00 - 16:00 | 130 | 0 | 0 | 0 |
| 27.11.2017 16:00 - 17:00 | 130 | 0 | 0 | 0 |
| 27.11.2017 17:00 - 18:00 | 130 | 0 | 0 | 0 |
| 27.11.2017 18:00 - 19:00 | 130 | 0 | 0 | 0 |
| 27.11.2017 19:00 - 20:00 | 130 | -100 | 0 | 0 |
| 27.11.2017 20:00 - 21:00 | 130 | -100 | 0 | 0 |
| 27.11.2017 21:00 - 22:00 | 130 | -100 | 0 | 0 |
| 27.11.2017 22:00 - 23:00 | 130 | -150 | 0 | 0 |
| 27.11.2017 23:00 - 24:00 | 130 | -200 | 0 | 0 |
| 28.11.2017 00:00 - 01:00 | 130 | -250 | 0 | 0 |
| 28.11.2017 01:00 - 02:00 | 130 | -250 | 0 | 0 |
| 28.11.2017 02:00 - 03:00 | 130 | -250 | 0 | 0 |
| 28.11.2017 03:00 - 04:00 | 130 | -300 | 0 | 0 |
| 28.11.2017 04:00 - 05:00 | 130 | -300 | 0 | 0 |
| 28.11.2017 05:00 - 06:00 | 130 | -300 | 0 | 0 |
| 28.11.2017 06:00 - 07:00 | 0 | 0 | 0 | 0 |
| 28.11.2017 07:00 - 08:00 | 0 | 0 | 0 | 0 |
| 28.11.2017 08:00 - 09:00 | 0 | 0 | 0 | 0 |
| 28.11.2017 09:00 - 10:00 | 0 | 0 | 0 | 0 |
| 28.11.2017 10:00 - 11:00 | 0 | 0 | 0 | 0 |
| 28.11.2017 11:00 - 12:00 | 0 | 0 | 0 | 0 |
| 28.11.2017 12:00 - 13:00 | 0 | 0 | 0 | 0 |
| 28.11.2017 13:00 - 14:00 | 0 | 0 | 0 | 0 |
| 28.11.2017 14:00 - 15:00 | 0 | 0 | 0 | 0 |
| 28.11.2017 15:00 - 16:00 | 0 | 0 | 0 | 0 |
| 28.11.2017 16:00 - 17:00 | 0 | 0 | 0 | 0 |
| 28.11.2017 17:00 - 18:00 | 0 | 0 | 0 | 0 |
| 28.11.2017 18:00 - 19:00 | 0 | 0 | 0 | 0 |
| 28.11.2017 19:00 - 20:00 | 0 | -50 | 0 | 0 |
| 28.11.2017 20:00 - 21:00 | 0 | -50 | 0 | 0 |
| 28.11.2017 21:00 - 22:00 | 0 | -50 | 0 | 0 |
| 28.11.2017 22:00 - 23:00 | 0 | -50 | 0 | 0 |
| 28.11.2017 23:00 - 24:00 | 0 | -50 | 0 | 0 |
| 29.11.2017 00:00 - 01:00 | 0 | -50 | 0 | 0 |
| 29.11.2017 01:00 - 02:00 | 0 | -50 | 0 | 0 |
| 29.11.2017 02:00 - 03:00 | 100 | -50 | 0 | 0 |
| 29.11.2017 03:00 - 04:00 | 100 | -50 | 0 | 0 |
| 29.11.2017 04:00 - 05:00 | 100 | -50 | 0 | 0 |
| 29.11.2017 05:00 - 06:00 | 100 | -50 | 0 | 0 |
| 29.11.2017 06:00 - 07:00 | 0 | 0 | 0 | 0 |
| 29.11.2017 07:00 - 08:00 | 0 | 0 | 0 | 0 |
| 29.11.2017 08:00 - 09:00 | 0 | 0 | 0 | 0 |
| 29.11.2017 09:00 - 10:00 | 0 | 0 | 0 | 0 |
| 29.11.2017 10:00 - 11:00 | 0 | 0 | 0 | 0 |
| 29.11.2017 11:00 - 12:00 | 0 | 0 | 0 | 0 |
| 29.11.2017 12:00 - 13:00 | 0 | 0 | 0 | 0 |
| 29.11.2017 13:00 - 14:00 | 0 | 0 | 0 | 0 |
| 29.11.2017 14:00 - 15:00 | 0 | 0 | 0 | 0 |
| 29.11.2017 15:00 - 16:00 | 0 | 0 | 0 | 0 |
| 29.11.2017 16:00 - 17:00 | 0 | 0 | 0 | 0 |
| 29.11.2017 17:00 - 18:00 | 0 | 0 | 0 | 0 |
| 29.11.2017 18:00 - 19:00 | 0 | 0 | 0 | 0 |
| 29.11.2017 19:00 - 20:00 | 0 | 0 | 0 | 0 |
| 29.11.2017 20:00 - 21:00 | 0 | 0 | 0 | 0 |
| 29.11.2017 21:00 - 22:00 | 0 | 0 | 0 | 0 |
| 29.11.2017 22:00 - 23:00 | 0 | 0 | 0 | 0 |
| 29.11.2017 23:00 - 24:00 | 0 | 0 | 0 | 0 |
| 30.11.2017 00:00 - 01:00 | 0 | 0 | 0 | 0 |
| 30.11.2017 01:00 - 02:00 | 0 | 0 | 0 | 0 |
| 30.11.2017 02:00 - 03:00 | 0 | 0 | 0 | 0 |
| 30.11.2017 03:00 - 04:00 | 0 | 0 | 0 | 0 |
| 30.11.2017 04:00 - 05:00 | 0 | 0 | 0 | 0 |
| 30.11.2017 05:00 - 06:00 | 0 | 0 | 0 | 0 |
| 30.11.2017 06:00 - 07:00 | 0 | 0 | 0 | 0 |
| 30.11.2017 07:00 - 08:00 | 0 | 0 | 0 | 0 |
| 30.11.2017 08:00 - 09:00 | 0 | 0 | 0 | 0 |
| 30.11.2017 09:00 - 10:00 | 0 | 0 | 0 | 0 |
| 30.11.2017 10:00 - 11:00 | 0 | 0 | 0 | 0 |
| 30.11.2017 11:00 - 12:00 | 0 | 0 | 0 | 0 |